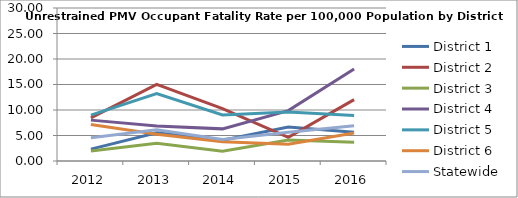
| Category | District 1 | District 2 | District 3 | District 4 | District 5 | District 6 | Statewide |
|---|---|---|---|---|---|---|---|
| 2012.0 | 2.321 | 8.451 | 1.971 | 8.014 | 8.996 | 7.159 | 4.575 |
| 2013.0 | 5.516 | 15.011 | 3.46 | 6.883 | 13.242 | 5.224 | 6.141 |
| 2014.0 | 4.065 | 10.277 | 1.899 | 6.299 | 9.024 | 3.769 | 4.222 |
| 2015.0 | 6.666 | 4.656 | 4.135 | 9.876 | 9.614 | 3.269 | 5.62 |
| 2016.0 | 5.65 | 12.029 | 3.66 | 18.046 | 8.939 | 5.499 | 6.892 |